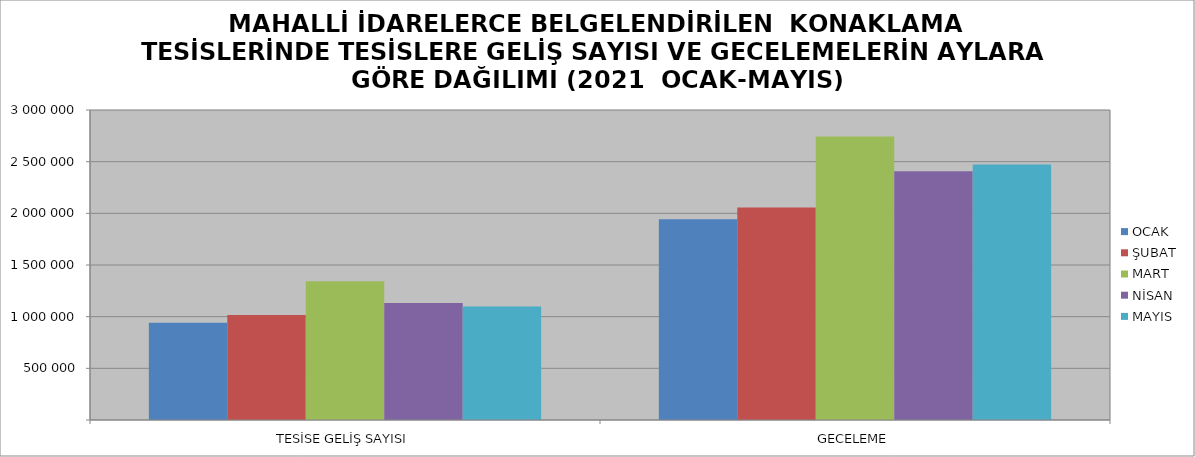
| Category | OCAK | ŞUBAT | MART | NİSAN | MAYIS |
|---|---|---|---|---|---|
| TESİSE GELİŞ SAYISI | 940331 | 1017199 | 1342202 | 1131069 | 1098456 |
| GECELEME | 1943007 | 2056594 | 2743257 | 2406723 | 2471826 |